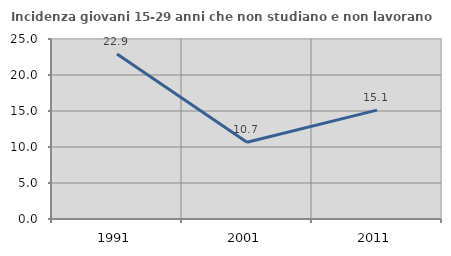
| Category | Incidenza giovani 15-29 anni che non studiano e non lavorano  |
|---|---|
| 1991.0 | 22.919 |
| 2001.0 | 10.669 |
| 2011.0 | 15.118 |